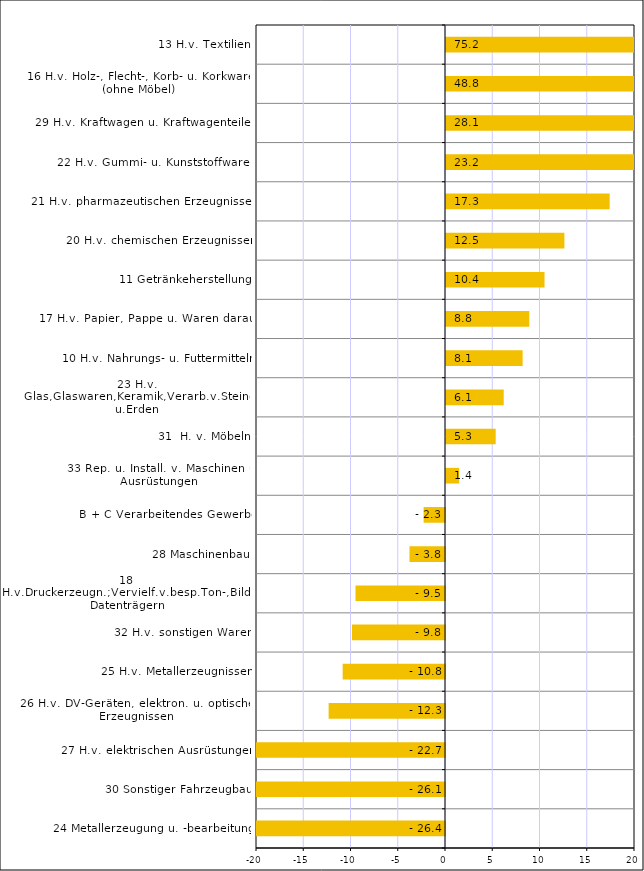
| Category | Series 0 |
|---|---|
| 24 Metallerzeugung u. -bearbeitung | -26.357 |
| 30 Sonstiger Fahrzeugbau | -26.073 |
| 27 H.v. elektrischen Ausrüstungen | -22.699 |
| 26 H.v. DV-Geräten, elektron. u. optischen Erzeugnissen | -12.315 |
| 25 H.v. Metallerzeugnissen | -10.829 |
| 32 H.v. sonstigen Waren | -9.845 |
| 18 H.v.Druckerzeugn.;Vervielf.v.besp.Ton-,Bild-u.Datenträgern | -9.472 |
| 28 Maschinenbau | -3.759 |
| B + C Verarbeitendes Gewerbe | -2.265 |
| 33 Rep. u. Install. v. Maschinen u. Ausrüstungen | 1.394 |
| 31  H. v. Möbeln | 5.257 |
| 23 H.v. Glas,Glaswaren,Keramik,Verarb.v.Steinen u.Erden | 6.107 |
| 10 H.v. Nahrungs- u. Futtermitteln | 8.111 |
| 17 H.v. Papier, Pappe u. Waren daraus | 8.813 |
| 11 Getränkeherstellung | 10.426 |
| 20 H.v. chemischen Erzeugnissen | 12.53 |
| 21 H.v. pharmazeutischen Erzeugnissen | 17.321 |
| 22 H.v. Gummi- u. Kunststoffwaren | 23.225 |
| 29 H.v. Kraftwagen u. Kraftwagenteilen | 28.054 |
| 16 H.v. Holz-, Flecht-, Korb- u. Korkwaren (ohne Möbel) | 48.809 |
| 13 H.v. Textilien | 75.23 |